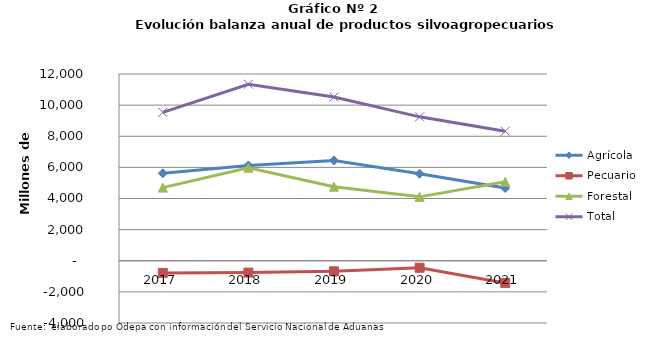
| Category | Agrícola | Pecuario | Forestal | Total |
|---|---|---|---|---|
| 2017.0 | 5619304 | -782654 | 4700192 | 9536842 |
| 2018.0 | 6126434 | -761998 | 5976134 | 11340570 |
| 2019.0 | 6446329 | -681646 | 4755333 | 10520016 |
| 2020.0 | 5590965 | -450130 | 4105622 | 9246457 |
| 2021.0 | 4672324 | -1424906 | 5074644 | 8322062 |